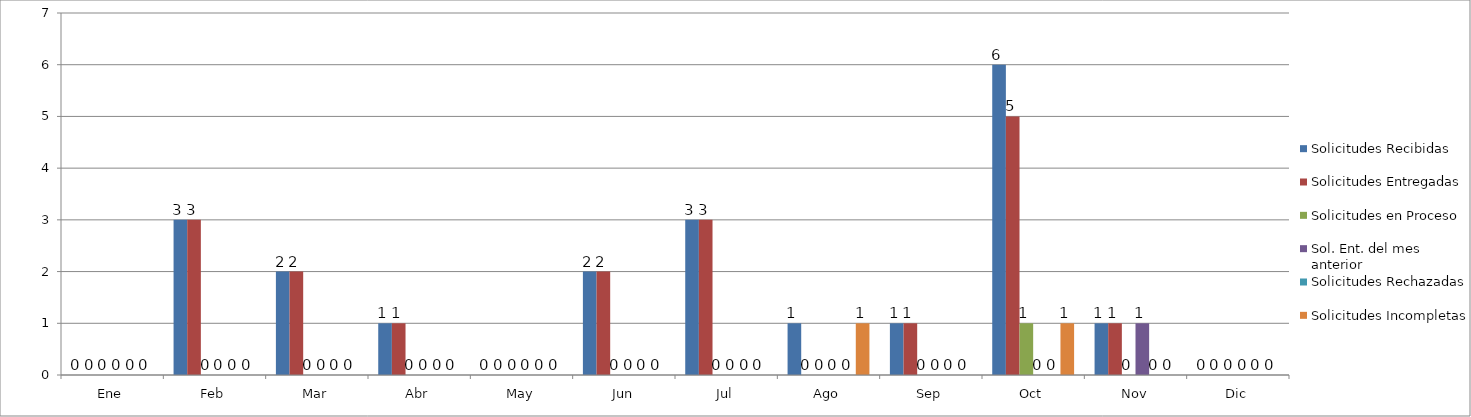
| Category | Solicitudes Recibidas  | Solicitudes Entregadas | Solicitudes en Proceso | Sol. Ent. del mes anterior | Solicitudes Rechazadas | Solicitudes Incompletas |
|---|---|---|---|---|---|---|
| Ene | 0 | 0 | 0 | 0 | 0 | 0 |
| Feb | 3 | 3 | 0 | 0 | 0 | 0 |
| Mar | 2 | 2 | 0 | 0 | 0 | 0 |
| Abr | 1 | 1 | 0 | 0 | 0 | 0 |
| May | 0 | 0 | 0 | 0 | 0 | 0 |
| Jun | 2 | 2 | 0 | 0 | 0 | 0 |
| Jul | 3 | 3 | 0 | 0 | 0 | 0 |
| Ago | 1 | 0 | 0 | 0 | 0 | 1 |
| Sep | 1 | 1 | 0 | 0 | 0 | 0 |
| Oct | 6 | 5 | 1 | 0 | 0 | 1 |
| Nov | 1 | 1 | 0 | 1 | 0 | 0 |
| Dic | 0 | 0 | 0 | 0 | 0 | 0 |